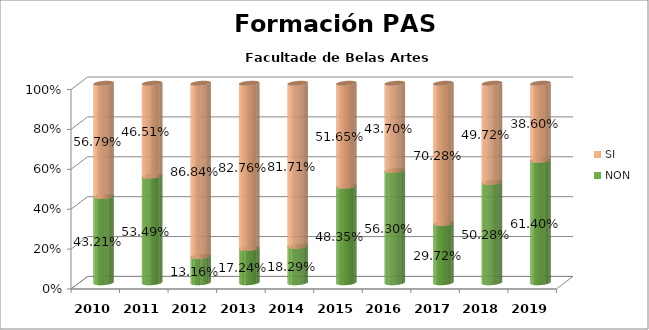
| Category | NON | SI |
|---|---|---|
| 2010.0 | 0.432 | 0.568 |
| 2011.0 | 0.535 | 0.465 |
| 2012.0 | 0.132 | 0.868 |
| 2013.0 | 0.172 | 0.828 |
| 2014.0 | 0.183 | 0.817 |
| 2015.0 | 0.484 | 0.516 |
| 2016.0 | 0.563 | 0.437 |
| 2017.0 | 0.297 | 0.703 |
| 2018.0 | 0.503 | 0.497 |
| 2019.0 | 0.614 | 0.386 |